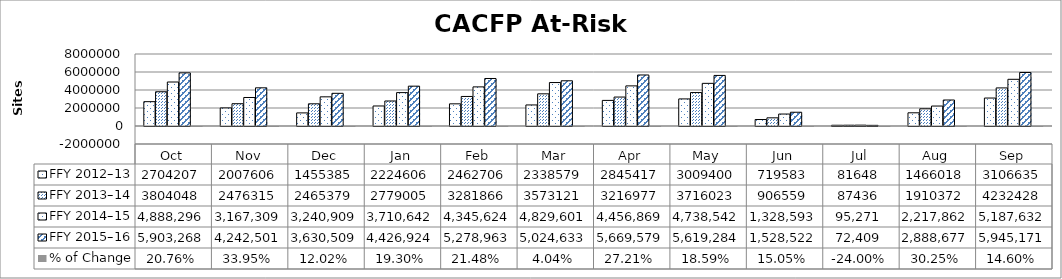
| Category | FFY 2012–13 | FFY 2013–14 | FFY 2014–15 | FFY 2015–16 | % of Change |
|---|---|---|---|---|---|
| _x0003_Oct | 2704207 | 3804048 | 4888296 | 5903268 | 0.208 |
| _x0003_Nov | 2007606 | 2476315 | 3167309 | 4242501 | 0.339 |
| _x0003_Dec | 1455385 | 2465379 | 3240909 | 3630509 | 0.12 |
| _x0003_Jan | 2224606 | 2779005 | 3710642 | 4426924 | 0.193 |
| _x0003_Feb | 2462706 | 3281866 | 4345624 | 5278963 | 0.215 |
| _x0003_Mar | 2338579 | 3573121 | 4829601 | 5024633 | 0.04 |
| _x0003_Apr | 2845417 | 3216977 | 4456869 | 5669579 | 0.272 |
| _x0003_May | 3009400 | 3716023 | 4738542 | 5619284 | 0.186 |
| _x0003_Jun | 719583 | 906559 | 1328593 | 1528522 | 0.15 |
| _x0003_Jul | 81648 | 87436 | 95271 | 72409 | -0.24 |
| _x0003_Aug | 1466018 | 1910372 | 2217862 | 2888677 | 0.302 |
| _x0003_Sep | 3106635 | 4232428 | 5187632 | 5945171 | 0.146 |